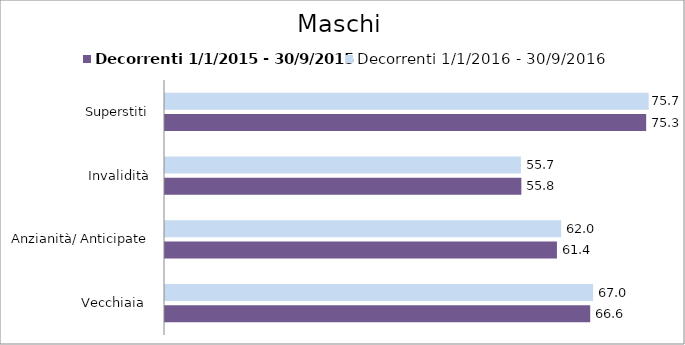
| Category | Decorrenti 1/1/2015 - 30/9/2015 | Decorrenti 1/1/2016 - 30/9/2016 |
|---|---|---|
| Vecchiaia  | 66.57 | 67.02 |
| Anzianità/ Anticipate | 61.36 | 62.02 |
| Invalidità | 55.79 | 55.72 |
| Superstiti | 75.33 | 75.73 |